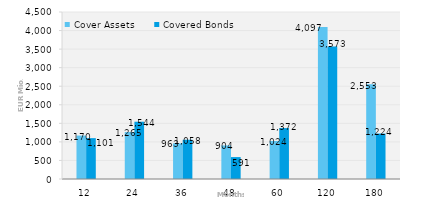
| Category | Cover Assets | Covered Bonds |
|---|---|---|
| 12.0 | 1170.119 | 1100.859 |
| 24.0 | 1265.027 | 1543.695 |
| 36.0 | 962.783 | 1057.901 |
| 48.0 | 903.914 | 590.5 |
| 60.0 | 1023.699 | 1372.113 |
| 120.0 | 4097.482 | 3572.546 |
| 180.0 | 2552.537 | 1224.352 |